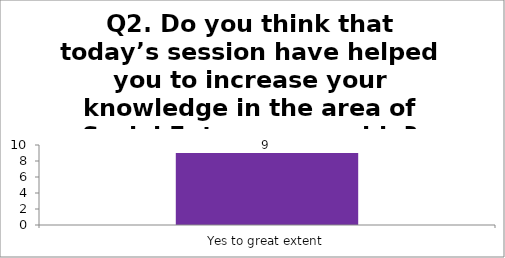
| Category | Q2. Do you think that today’s session have helped you to increase your knowledge in the area of Social Entrepreneurship? |
|---|---|
| Yes to great extent | 9 |